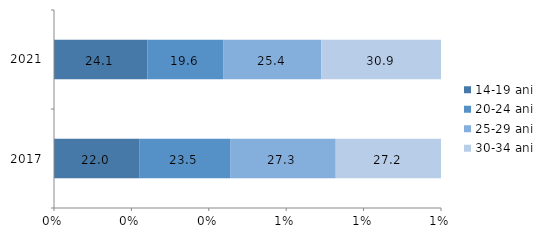
| Category | 14-19 ani | 20-24 ani | 25-29 ani | 30-34 ani |
|---|---|---|---|---|
| 2017.0 | 22 | 23.5 | 27.3 | 27.2 |
| 2021.0 | 24.1 | 19.6 | 25.4 | 30.9 |